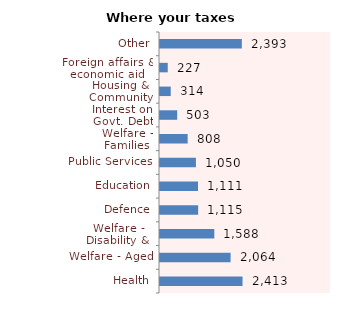
| Category | Series 0 |
|---|---|
| Health | 2412.993 |
| Welfare - Aged | 2063.816 |
| Welfare - Disability & Unemployed | 1588.282 |
| Defence | 1115.466 |
| Education | 1111.39 |
| Public Services | 1050.25 |
| Welfare - Families | 808.407 |
| Interest on Govt. Debt | 502.707 |
| Housing & Community | 313.852 |
| Foreign affairs & economic aid | 226.897 |
| Other | 2392.613 |